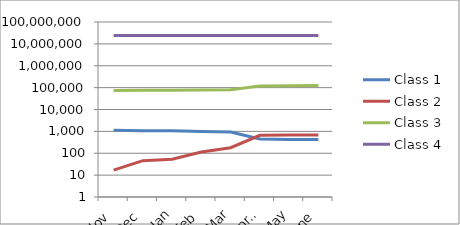
| Category | Class 1 | Class 2 | Class 3 | Class 4 |
|---|---|---|---|---|
| Nov | 1131 | 17 | 74030 | 23941127 |
| Dec | 1078 | 46 | 75711 | 23957573 |
| Jan | 1067 | 53 | 76685 | 23972323 |
| Feb | 990 | 115 | 78345 | 23986004 |
| Mar | 930 | 179 | 80084 | 23996449 |
| April | 449 | 663 | 119857 | 23975239 |
| May | 420 | 686 | 121241 | 23988139 |
| June | 422 | 687 | 123483 | 24005430 |